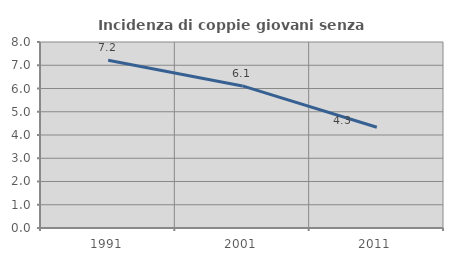
| Category | Incidenza di coppie giovani senza figli |
|---|---|
| 1991.0 | 7.212 |
| 2001.0 | 6.111 |
| 2011.0 | 4.332 |